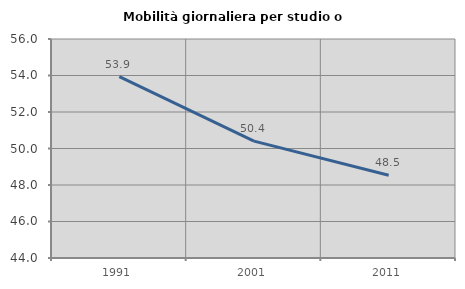
| Category | Mobilità giornaliera per studio o lavoro |
|---|---|
| 1991.0 | 53.941 |
| 2001.0 | 50.405 |
| 2011.0 | 48.533 |